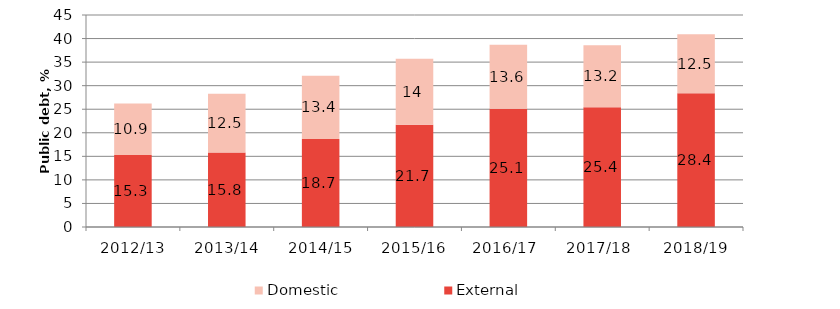
| Category | External | Domestic |
|---|---|---|
| 2012/13 | 15.3 | 10.9 |
| 2013/14 | 15.8 | 12.5 |
| 2014/15 | 18.7 | 13.4 |
| 2015/16 | 21.7 | 14 |
| 2016/17  | 25.1 | 13.6 |
| 2017/18  | 25.4 | 13.2 |
| 2018/19 | 28.4 | 12.5 |